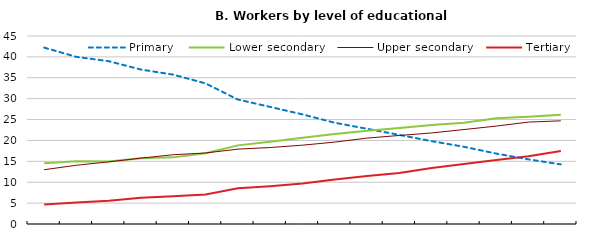
| Category | Primary | Lower secondary | Upper secondary | Tertiary |
|---|---|---|---|---|
|  | 42.224 | 14.539 | 12.995 | 4.651 |
|  | 40.002 | 15.032 | 14.064 | 5.128 |
|  | 38.97 | 14.97 | 14.87 | 5.54 |
|  | 36.966 | 15.745 | 15.769 | 6.268 |
|  | 35.751 | 15.948 | 16.581 | 6.628 |
|  | 33.647 | 16.916 | 17.001 | 7.071 |
|  | 29.79 | 18.818 | 17.919 | 8.578 |
|  | 28.023 | 19.666 | 18.307 | 9.043 |
|  | 26.238 | 20.628 | 18.867 | 9.68 |
|  | 24.235 | 21.533 | 19.606 | 10.666 |
|  | 22.789 | 22.345 | 20.565 | 11.478 |
|  | 21.321 | 23.005 | 21.192 | 12.215 |
|  | 19.833 | 23.709 | 21.797 | 13.386 |
|  | 18.483 | 24.224 | 22.61 | 14.341 |
|  | 16.853 | 25.298 | 23.435 | 15.331 |
|  | 15.466 | 25.7 | 24.396 | 16.221 |
|  | 14.267 | 26.164 | 24.692 | 17.447 |